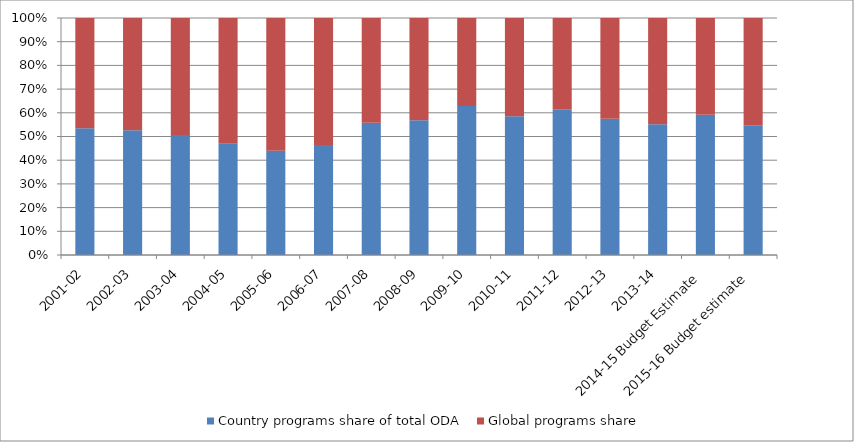
| Category | Country programs share of total ODA | Global programs share |
|---|---|---|
| 2001-02 | 0.535 | 0.465 |
| 2002-03 | 0.526 | 0.474 |
| 2003-04 | 0.506 | 0.494 |
| 2004-05 | 0.47 | 0.53 |
| 2005-06 | 0.44 | 0.56 |
| 2006-07 | 0.464 | 0.536 |
| 2007-08 | 0.558 | 0.442 |
| 2008-09 | 0.569 | 0.431 |
| 2009-10 | 0.629 | 0.371 |
| 2010-11 | 0.585 | 0.415 |
| 2011-12 | 0.615 | 0.385 |
| 2012-13 | 0.575 | 0.425 |
| 2013-14 | 0.552 | 0.448 |
| 2014-15 Budget Estimate | 0.592 | 0.408 |
| 2015-16 Budget estimate | 0.548 | 0.452 |